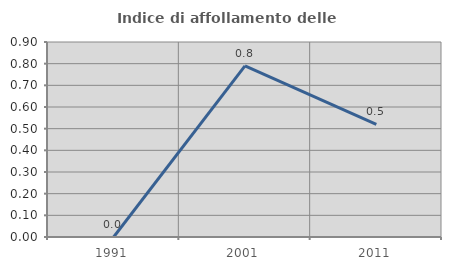
| Category | Indice di affollamento delle abitazioni  |
|---|---|
| 1991.0 | 0 |
| 2001.0 | 0.789 |
| 2011.0 | 0.519 |